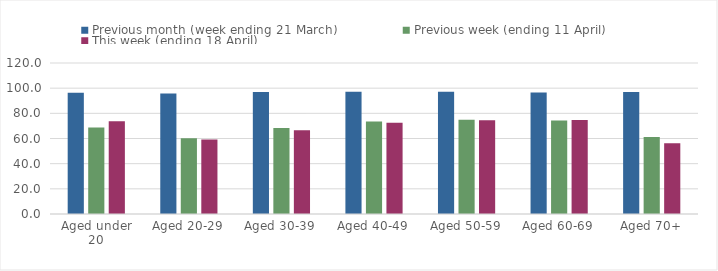
| Category | Previous month (week ending 21 March) | Previous week (ending 11 April) | This week (ending 18 April) |
|---|---|---|---|
| Aged under 20 | 96.446 | 68.68 | 73.703 |
| Aged 20-29 | 95.767 | 60.195 | 59.22 |
| Aged 30-39 | 96.908 | 68.354 | 66.579 |
| Aged 40-49 | 97.137 | 73.527 | 72.53 |
| Aged 50-59 | 97.132 | 74.813 | 74.458 |
| Aged 60-69 | 96.586 | 74.333 | 74.645 |
| Aged 70+ | 97.001 | 61.137 | 56.259 |